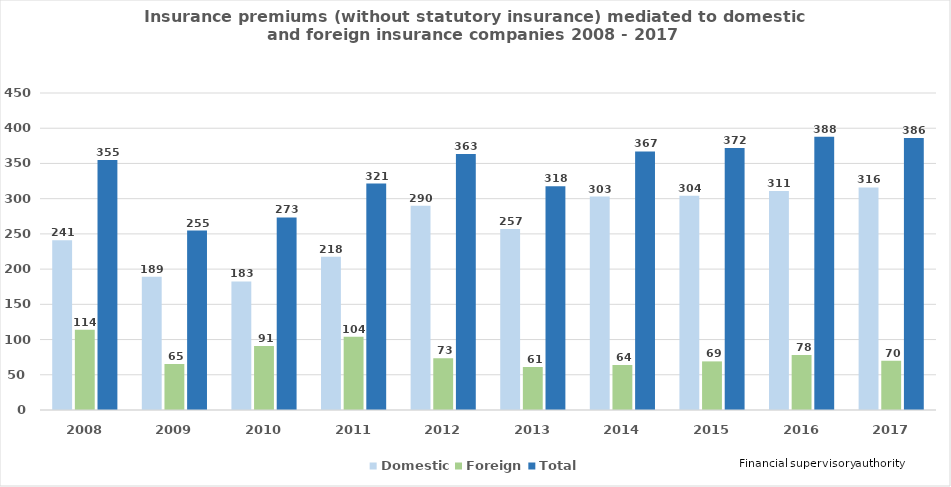
| Category | Domestic | Foreign | Total |
|---|---|---|---|
| 2008.0 | 241 | 114 | 355 |
| 2009.0 | 189.249 | 65.417 | 254.666 |
| 2010.0 | 182.562 | 90.729 | 273.291 |
| 2011.0 | 217.55 | 103.894 | 321.444 |
| 2012.0 | 289.922 | 73.321 | 363.243 |
| 2013.0 | 257 | 61 | 317.523 |
| 2014.0 | 303 | 64 | 367 |
| 2015.0 | 304 | 69 | 372 |
| 2016.0 | 311 | 78 | 388 |
| 2017.0 | 316 | 70 | 386 |